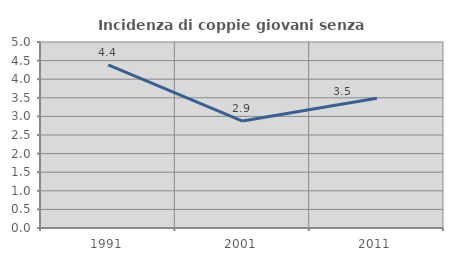
| Category | Incidenza di coppie giovani senza figli |
|---|---|
| 1991.0 | 4.384 |
| 2001.0 | 2.874 |
| 2011.0 | 3.488 |